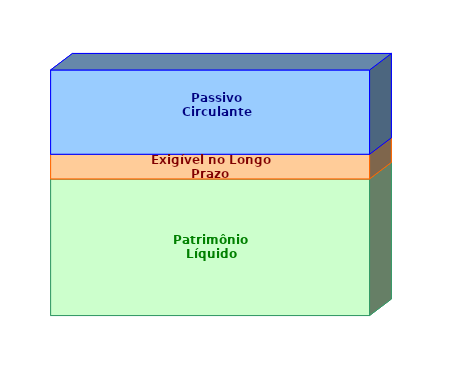
| Category | Patrimônio Líquido | Exigível no Longo Prazo | Passivo Circulante |
|---|---|---|---|
| 0 | 0.556 | 0.1 | 0.343 |